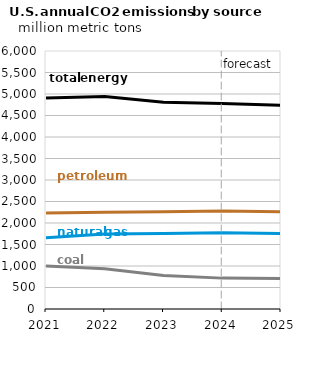
| Category | Liquid biofuels | Total energy | Natural gas | Coal |
|---|---|---|---|---|
| 2021.0 | 2234.823 | 4904.569 | 1656.12 | 1002.651 |
| 2022.0 | 2249.464 | 4941.232 | 1742.143 | 938.649 |
| 2023.0 | 2259.078 | 4806.942 | 1755.792 | 781.097 |
| 2024.0 | 2276.672 | 4780.64 | 1774.953 | 718.039 |
| 2025.0 | 2263.254 | 4738.137 | 1756.836 | 707.072 |